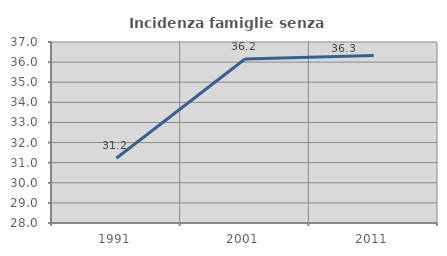
| Category | Incidenza famiglie senza nuclei |
|---|---|
| 1991.0 | 31.223 |
| 2001.0 | 36.154 |
| 2011.0 | 36.33 |